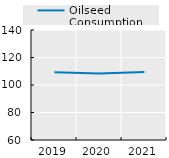
| Category | Oilseed Consumption |
|---|---|
| 2019.0 | 109.278 |
| 2020.0 | 108.311 |
| 2021.0 | 109.386 |